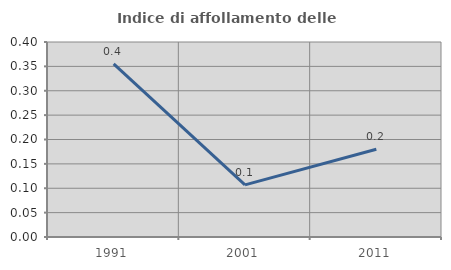
| Category | Indice di affollamento delle abitazioni  |
|---|---|
| 1991.0 | 0.355 |
| 2001.0 | 0.107 |
| 2011.0 | 0.18 |